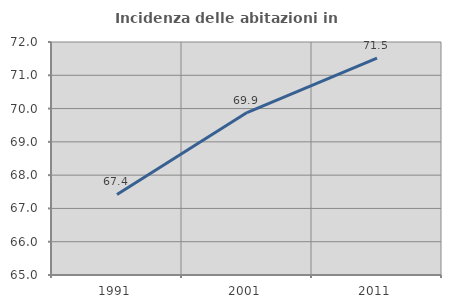
| Category | Incidenza delle abitazioni in proprietà  |
|---|---|
| 1991.0 | 67.421 |
| 2001.0 | 69.88 |
| 2011.0 | 71.515 |